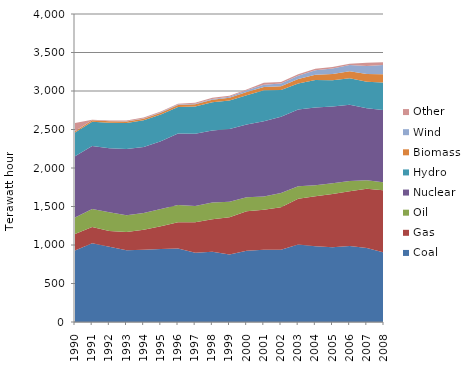
| Category | Coal | Gas | Oil | Nuclear | Hydro | Biomass | Wind | Other |
|---|---|---|---|---|---|---|---|---|
| 1990.0 | 927.691 | 215.928 | 214.749 | 794.875 | 307.622 | 17.301 | 0.778 | 104.778 |
| 1991.0 | 1023.939 | 211.19 | 230.841 | 820.034 | 314.846 | 18.259 | 1.096 | 7.474 |
| 1992.0 | 978.237 | 203.523 | 244.324 | 828.98 | 333.516 | 18.383 | 1.55 | 7.952 |
| 1993.0 | 930.286 | 238.112 | 217.657 | 861.909 | 337.061 | 20.044 | 2.356 | 9.356 |
| 1994.0 | 938.567 | 261.079 | 215.723 | 858.764 | 344.629 | 22.065 | 3.494 | 10.835 |
| 1995.0 | 948.73 | 294.459 | 223.259 | 881.821 | 345.97 | 24.349 | 4.069 | 9.932 |
| 1996.0 | 955.736 | 338.741 | 224.459 | 927.548 | 346.22 | 26.055 | 4.848 | 9.56 |
| 1997.0 | 900.688 | 393.147 | 212.675 | 937.346 | 354.074 | 28.746 | 7.332 | 12.2 |
| 1998.0 | 912.092 | 423.662 | 217.091 | 932.851 | 368.865 | 31.373 | 11.278 | 13.512 |
| 1999.0 | 875.207 | 486.619 | 200.889 | 943.949 | 369.099 | 36.614 | 14.204 | 12.962 |
| 2000.0 | 926.895 | 511.777 | 179.913 | 944.993 | 381.937 | 40.549 | 22.25 | 12.624 |
| 2001.0 | 938.779 | 518.713 | 172.173 | 978.986 | 402.051 | 42.787 | 26.977 | 27.574 |
| 2002.0 | 937.502 | 553.756 | 184.145 | 990.196 | 347.931 | 49.715 | 35.746 | 17.962 |
| 2003.0 | 1005.273 | 595.309 | 162.593 | 995.86 | 338.307 | 57.915 | 44.358 | 16.531 |
| 2004.0 | 983.827 | 647.724 | 145.764 | 1008.437 | 357.147 | 68.851 | 58.815 | 18.66 |
| 2005.0 | 969.245 | 693.333 | 139.123 | 997.699 | 341.744 | 80.685 | 70.485 | 18.088 |
| 2006.0 | 986.968 | 712.085 | 131.932 | 989.877 | 344.348 | 90.128 | 82.306 | 15.87 |
| 2007.0 | 961.617 | 768.363 | 110.03 | 935.277 | 344.236 | 100.76 | 104.337 | 43.072 |
| 2008.0 | 901.268 | 808.281 | 104.498 | 937.236 | 359.185 | 107.855 | 118.733 | 37.126 |